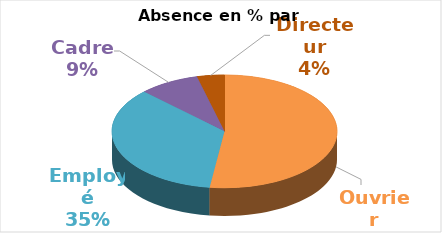
| Category | en % |
|---|---|
| Ouvrier | 0.037 |
| Employé | 0.025 |
| Cadre | 0.006 |
| Directeur | 0.003 |